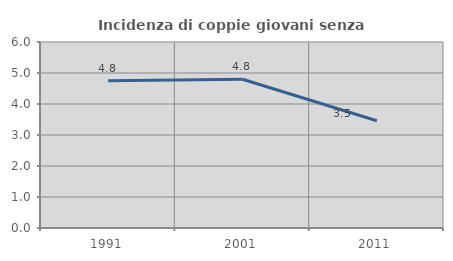
| Category | Incidenza di coppie giovani senza figli |
|---|---|
| 1991.0 | 4.751 |
| 2001.0 | 4.798 |
| 2011.0 | 3.459 |